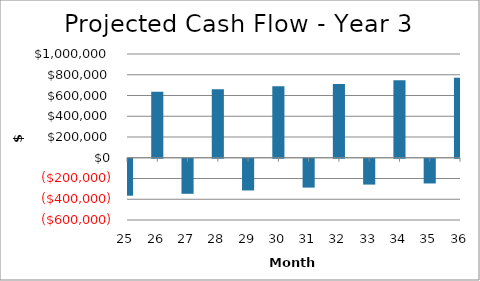
| Category | Year 3 |
|---|---|
| 25.0 | -356130.862 |
| 26.0 | 636011.205 |
| 27.0 | -337840.91 |
| 28.0 | 661275.124 |
| 29.0 | -305560.159 |
| 30.0 | 687977.132 |
| 31.0 | -278095.648 |
| 32.0 | 709856.274 |
| 33.0 | -249009.744 |
| 34.0 | 746201.608 |
| 35.0 | -238185.807 |
| 36.0 | 771581.994 |